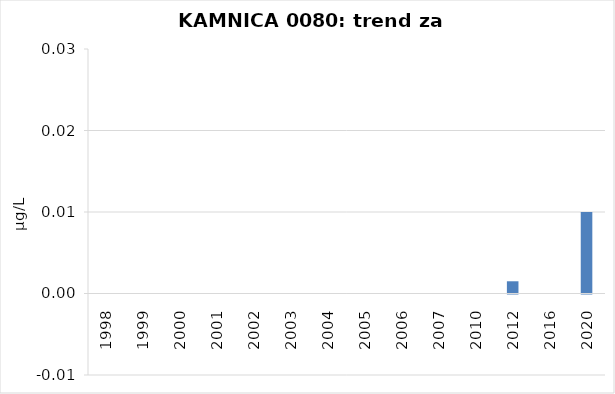
| Category | Vsota |
|---|---|
| 1998 | 0 |
| 1999 | 0 |
| 2000 | 0 |
| 2001 | 0 |
| 2002 | 0 |
| 2003 | 0 |
| 2004 | 0 |
| 2005 | 0 |
| 2006 | 0 |
| 2007 | 0 |
| 2010 | 0 |
| 2012 | 0.002 |
| 2016 | 0 |
| 2020 | 0.01 |